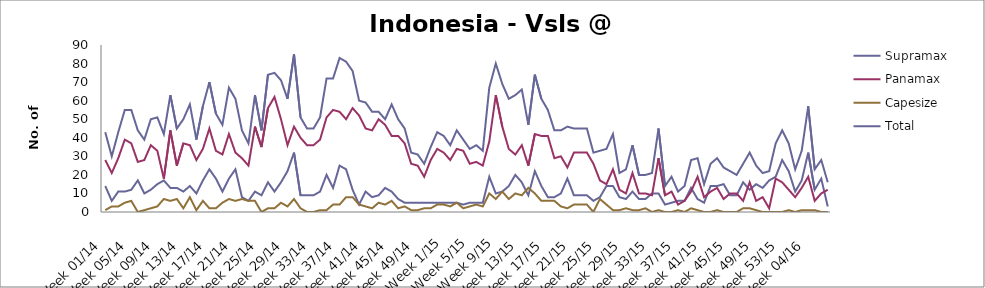
| Category | Supramax | Panamax | Capesize | Total |
|---|---|---|---|---|
| Week 01/14 | 14 | 28 | 1 | 43 |
| Week 02/14 | 6 | 21 | 3 | 30 |
| Week 03/14 | 11 | 29 | 3 | 43 |
| Week 04/14 | 11 | 39 | 5 | 55 |
| Week 05/14 | 12 | 37 | 6 | 55 |
| Week 06/14 | 17 | 27 | 0 | 44 |
| Week 07/14 | 10 | 28 | 1 | 39 |
| Week 08/14 | 12 | 36 | 2 | 50 |
| Week 09/14 | 15 | 33 | 3 | 51 |
| Week 10/14 | 17 | 18 | 7 | 42 |
| Week 11/14 | 13 | 44 | 6 | 63 |
| Week 12/14 | 13 | 25 | 7 | 45 |
| Week 13/14 | 11 | 37 | 2 | 50 |
| Week 14/14 | 14 | 36 | 8 | 58 |
| Week 15/14 | 10 | 28 | 1 | 39 |
| Week 16/14 | 17 | 34 | 6 | 57 |
| Week 17/14 | 23 | 45 | 2 | 70 |
| Week 18/14 | 18 | 33 | 2 | 53 |
| Week 19/14 | 11 | 31 | 5 | 47 |
| Week 20/14 | 18 | 42 | 7 | 67 |
| Week 21/14 | 23 | 32 | 6 | 61 |
| Week 22/14 | 8 | 29 | 7 | 44 |
| Week 23/14 | 6 | 25 | 6 | 37 |
| Week 24/14 | 11 | 46 | 6 | 63 |
| Week 25/14 | 9 | 35 | 0 | 44 |
| Week 26/14 | 16 | 56 | 2 | 74 |
| Week 27/14 | 11 | 62 | 2 | 75 |
| Week 28/14 | 16 | 50 | 5 | 71 |
| Week 29/14 | 22 | 36 | 3 | 61 |
| Week 30/14 | 32 | 46 | 7 | 85 |
| Week 31/14 | 9 | 40 | 2 | 51 |
| Week 32/14 | 9 | 36 | 0 | 45 |
| Week 33/14 | 9 | 36 | 0 | 45 |
| Week 34/14 | 11 | 39 | 1 | 51 |
| Week 35/14 | 20 | 51 | 1 | 72 |
| Week 36/14 | 13 | 55 | 4 | 72 |
| Week 37/14 | 25 | 54 | 4 | 83 |
| Week 38/14 | 23 | 50 | 8 | 81 |
| Week 39/14 | 12 | 56 | 8 | 76 |
| Week 40/14 | 4 | 52 | 4 | 60 |
| Week 41/14 | 11 | 45 | 3 | 59 |
| Week 42/14 | 8 | 44 | 2 | 54 |
| Week 43/14 | 9 | 50 | 5 | 54 |
| Week 44/14 | 13 | 47 | 4 | 50 |
| Week 45/14 | 11 | 41 | 6 | 58 |
| Week 46/14 | 7 | 41 | 2 | 50 |
| Week 47/14 | 5 | 37 | 3 | 45 |
| Week 48/14 | 5 | 26 | 1 | 32 |
| Week 49/14 | 5 | 25 | 1 | 31 |
| Week 50/14 | 5 | 19 | 2 | 26 |
| Week 51/14 | 5 | 28 | 2 | 35 |
| Week 52/14 | 5 | 34 | 4 | 43 |
| Week 1/15 | 5 | 32 | 4 | 41 |
| Week 2/15 | 5 | 28 | 3 | 36 |
| Week 3/15 | 5 | 34 | 5 | 44 |
| Week 4/15 | 4 | 33 | 2 | 39 |
| Week 5/15 | 5 | 26 | 3 | 34 |
| Week 6/15 | 5 | 27 | 4 | 36 |
| Week 7/15 | 5 | 25 | 3 | 33 |
| Week 8/15 | 19 | 38 | 10 | 67 |
| Week 9/15 | 10 | 63 | 7 | 80 |
| Week 10/15 | 11 | 46 | 11 | 69 |
| Week 11/15 | 14 | 34 | 7 | 61 |
| Week 12/15 | 20 | 31 | 10 | 63 |
| Week 13/15 | 16 | 36 | 9 | 66 |
| Week 14/15 | 9 | 25 | 13 | 47 |
| Week 15/15 | 22 | 42 | 10 | 74 |
| Week 16/15 | 14 | 41 | 6 | 61 |
| Week 17/15 | 8 | 41 | 6 | 55 |
| Week 18/15 | 8 | 29 | 6 | 44 |
| Week 19/15 | 10 | 30 | 3 | 44 |
| Week 20/15 | 18 | 24 | 2 | 46 |
| Week 21/15 | 9 | 32 | 4 | 45 |
| Week 22/15 | 9 | 32 | 4 | 45 |
| Week 23/15 | 9 | 32 | 4 | 45 |
| Week 24/15 | 6 | 26 | 0 | 32 |
| Week 25/15 | 8 | 17 | 7 | 33 |
| Week 26/15 | 14 | 15 | 4 | 34 |
| Week 27/15 | 14 | 23 | 1 | 42 |
| Week 28/15 | 8 | 12 | 1 | 21 |
| Week 29/15 | 7 | 10 | 2 | 23 |
| Week 30/15 | 11 | 21 | 1 | 36 |
| Week 31/15 | 7 | 10 | 1 | 20 |
| Week 32/15 | 7 | 10 | 2 | 20 |
| Week 33/15 | 10 | 9 | 0 | 21 |
| Week 34/15 | 10 | 29 | 1 | 45 |
| Week 35/15 | 4 | 9 | 0 | 14 |
| Week 36/15 | 5 | 11 | 0 | 19 |
| Week 37/15 | 6 | 4 | 1 | 11 |
| Week 38/15 | 6 | 6 | 0 | 14 |
| Week 39/15 | 13 | 11 | 2 | 28 |
| Week 40/15 | 7 | 19 | 1 | 29 |
| Week 41/15 | 5 | 8 | 0 | 15 |
| Week 42/15 | 14 | 11 | 0 | 26 |
| Week 43/15 | 14 | 13 | 1 | 29 |
| Week 44/15 | 15 | 7 | 0 | 24 |
| Week 45/15 | 9 | 10 | 0 | 22 |
| Week 46/15 | 9 | 10 | 0 | 20 |
| Week 47/15 | 16 | 6 | 2 | 26 |
| Week 48/15 | 12 | 16 | 2 | 32 |
| Week 49/15 | 15 | 6 | 1 | 25 |
| Week 50/15 | 13 | 8 | 0 | 21 |
| Week 51/15 | 17 | 2 | 0 | 22 |
| Week 52/15 | 19 | 18 | 0 | 37 |
| Week 53/15 | 28 | 16 | 0 | 44 |
| Week 01/16 | 22 | 12 | 1 | 37 |
| Week 02/16 | 11 | 8 | 0 | 23 |
| Week 03/16 | 17 | 13 | 1 | 33 |
| Week 04/16 | 32 | 19 | 1 | 57 |
| Week 05/16 | 12 | 6 | 1 | 23 |
| Week 06/16 | 18 | 10 | 0 | 28 |
| Week 07/16 | 3 | 12 | 0 | 16 |